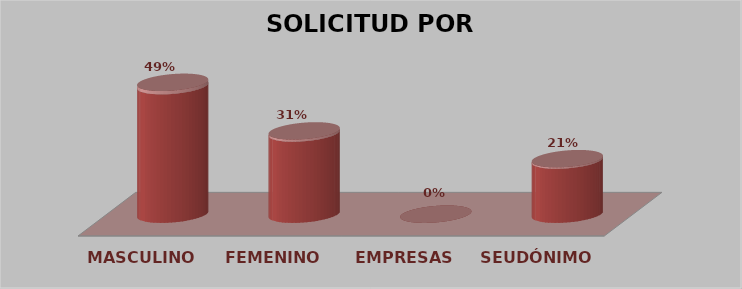
| Category | SOLICITUD POR GÉNERO | Series 1 |
|---|---|---|
| MASCULINO | 19 | 0.487 |
| FEMENINO | 12 | 0.308 |
| EMPRESAS | 0 | 0 |
| SEUDÓNIMO | 8 | 0.205 |